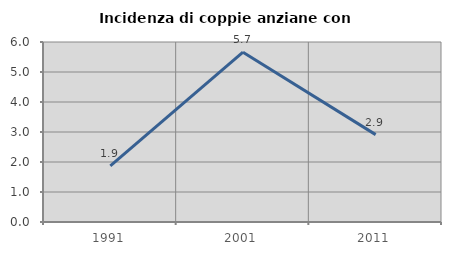
| Category | Incidenza di coppie anziane con figli |
|---|---|
| 1991.0 | 1.869 |
| 2001.0 | 5.66 |
| 2011.0 | 2.913 |